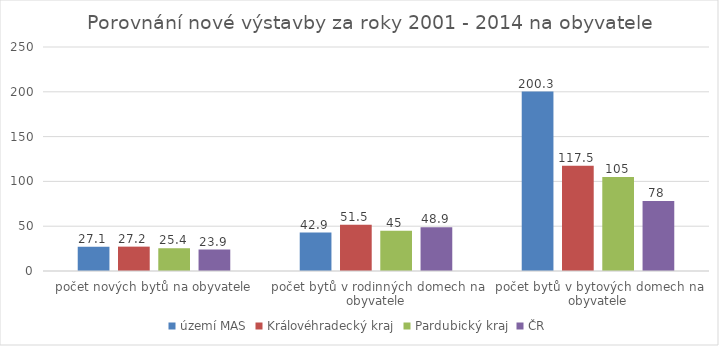
| Category | území MAS | Královéhradecký kraj | Pardubický kraj | ČR |
|---|---|---|---|---|
| počet nových bytů na obyvatele | 27.1 | 27.2 | 25.4 | 23.9 |
| počet bytů v rodinných domech na obyvatele | 42.9 | 51.5 | 45 | 48.9 |
| počet bytů v bytových domech na obyvatele | 200.3 | 117.5 | 105 | 78 |